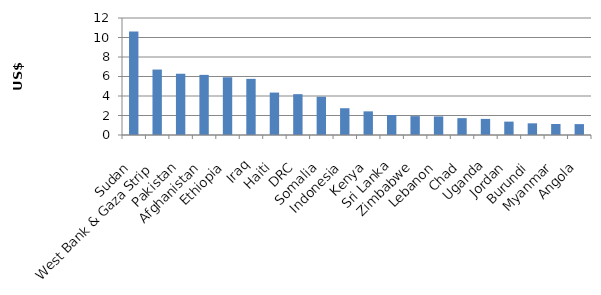
| Category | Series 0 |
|---|---|
| Sudan | 10.62 |
| West Bank & Gaza Strip | 6.713 |
| Pakistan | 6.283 |
| Afghanistan | 6.168 |
| Ethiopia | 5.923 |
| Iraq | 5.758 |
| Haiti | 4.351 |
| DRC | 4.188 |
| Somalia | 3.925 |
| Indonesia | 2.746 |
| Kenya | 2.425 |
| Sri Lanka | 2.051 |
| Zimbabwe | 1.936 |
| Lebanon | 1.908 |
| Chad | 1.729 |
| Uganda | 1.651 |
| Jordan | 1.372 |
| Burundi | 1.197 |
| Myanmar | 1.128 |
| Angola | 1.118 |